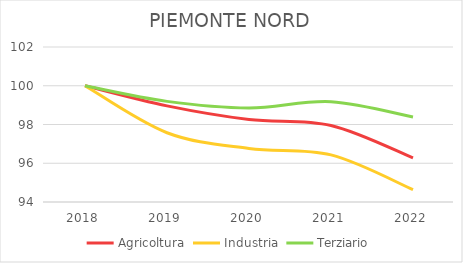
| Category | Agricoltura | Industria | Terziario |
|---|---|---|---|
| 2018.0 | 100 | 100 | 100 |
| 2019.0 | 98.96 | 97.575 | 99.193 |
| 2020.0 | 98.258 | 96.762 | 98.854 |
| 2021.0 | 97.949 | 96.431 | 99.173 |
| 2022.0 | 96.277 | 94.638 | 98.386 |